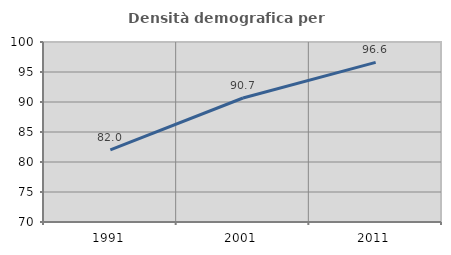
| Category | Densità demografica |
|---|---|
| 1991.0 | 82.012 |
| 2001.0 | 90.663 |
| 2011.0 | 96.611 |